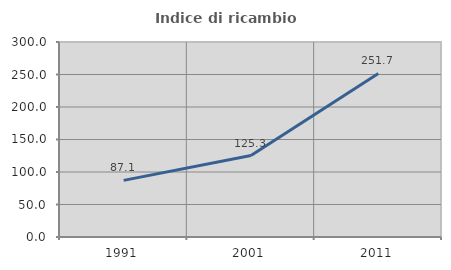
| Category | Indice di ricambio occupazionale  |
|---|---|
| 1991.0 | 87.116 |
| 2001.0 | 125.275 |
| 2011.0 | 251.697 |